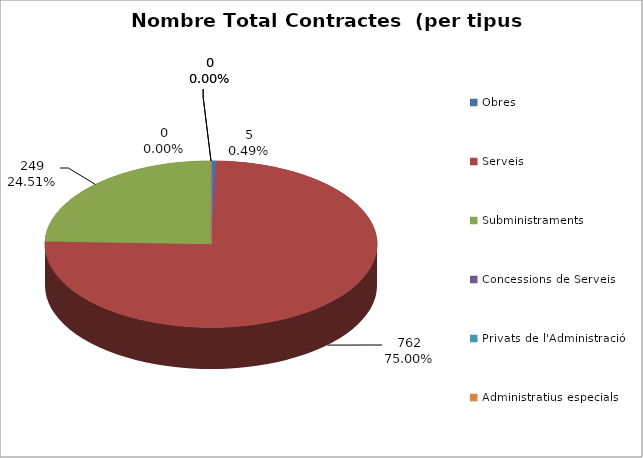
| Category | Nombre Total Contractes |
|---|---|
| Obres | 5 |
| Serveis | 762 |
| Subministraments | 249 |
| Concessions de Serveis | 0 |
| Privats de l'Administració | 0 |
| Administratius especials | 0 |